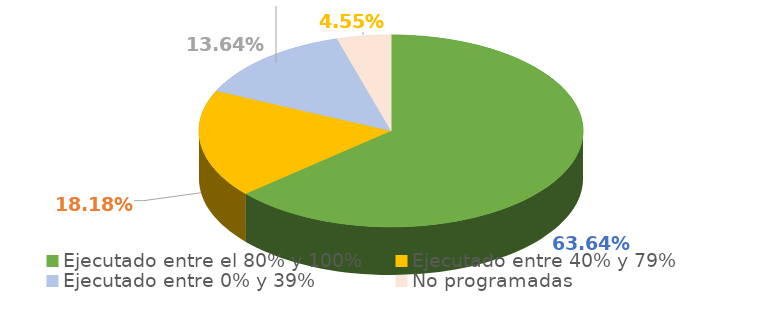
| Category | Series 0 |
|---|---|
| Ejecutado entre el 80% y 100% | 0.636 |
| Ejecutado entre 40% y 79% | 0.182 |
| Ejecutado entre 0% y 39% | 0.136 |
| No programadas | 0.045 |